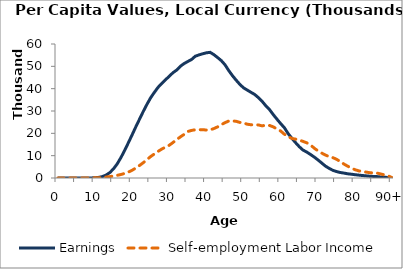
| Category | Earnings | Self-employment Labor Income |
|---|---|---|
| 0 | 0 | 0 |
|  | 0 | 0 |
| 2 | 0 | 0 |
| 3 | 0 | 0 |
| 4 | 0 | 0 |
| 5 | 0 | 0 |
| 6 | 0 | 21.203 |
| 7 | 6.211 | 26.112 |
| 8 | 13.631 | 31.021 |
| 9 | 36.46 | 40.029 |
| 10 | 109.593 | 63.723 |
| 11 | 287.129 | 119.737 |
| 12 | 644.481 | 234.313 |
| 13 | 1314.077 | 408.48 |
| 14 | 2434.62 | 633.393 |
| 15 | 4140.837 | 884.783 |
| 16 | 6378.06 | 1205.634 |
| 17 | 9210.337 | 1570.938 |
| 18 | 12388.586 | 2060.446 |
| 19 | 15845.288 | 2670.947 |
| 20 | 19355.538 | 3469.9 |
| 21 | 22941.965 | 4473.866 |
| 22 | 26385.965 | 5607.548 |
| 23 | 29815.259 | 6860.914 |
| 24 | 33014.417 | 8262.731 |
| 25 | 35968.337 | 9622.382 |
| 26 | 38393.078 | 10797.659 |
| 27 | 40632.079 | 11926.766 |
| 28 | 42365.035 | 12986.202 |
| 29 | 44020.9 | 13881.309 |
| 30 | 45557.453 | 14664.046 |
| 31 | 47165.605 | 15904.864 |
| 32 | 48342.145 | 17184.594 |
| 33 | 50043.633 | 18428.357 |
| 34 | 51256.093 | 19546.565 |
| 35 | 52176.635 | 20822.652 |
| 36 | 53066.418 | 21310.273 |
| 37 | 54524.137 | 21589.154 |
| 38 | 55120.665 | 21610.498 |
| 39 | 55621.138 | 21638.359 |
| 40 | 56058.348 | 21465.025 |
| 41 | 56268.849 | 21585.601 |
| 42 | 55240.251 | 22130.619 |
| 43 | 53937.381 | 22884.343 |
| 44 | 52566.379 | 23880.912 |
| 45 | 50703.274 | 24769.186 |
| 46 | 48118.833 | 25509.192 |
| 47 | 45835.288 | 25568.089 |
| 48 | 43801.718 | 25388.945 |
| 49 | 41917.652 | 24890.932 |
| 50 | 40367.704 | 24657.823 |
| 51 | 39353.933 | 24079.094 |
| 52 | 38359.489 | 23843.827 |
| 53 | 37394.204 | 23791.72 |
| 54 | 35974.403 | 23765.504 |
| 55 | 34312.93 | 23332.266 |
| 56 | 32307.607 | 23700.294 |
| 57 | 30589.668 | 23513.17 |
| 58 | 28375.7 | 22896.49 |
| 59 | 26311.052 | 21933.21 |
| 60 | 24334.995 | 21024.952 |
| 61 | 22480.178 | 19590.902 |
| 62 | 19874.852 | 18523.741 |
| 63 | 17780.469 | 17724.275 |
| 64 | 15823.091 | 17398.207 |
| 65 | 14010.376 | 16961.171 |
| 66 | 12499.804 | 16397.609 |
| 67 | 11629.135 | 15756.716 |
| 68 | 10552.16 | 14849.387 |
| 69 | 9414.606 | 13376.554 |
| 70 | 8130.794 | 12184.746 |
| 71 | 6762.993 | 11187.957 |
| 72 | 5372.892 | 10303.93 |
| 73 | 4345.826 | 9599.315 |
| 74 | 3471.118 | 9144.689 |
| 75 | 2905.792 | 8401.918 |
| 76 | 2468.069 | 7419.678 |
| 77 | 2211.952 | 6263.083 |
| 78 | 1888.181 | 5315.838 |
| 79 | 1703.005 | 4451.758 |
| 80 | 1476.869 | 3722.581 |
| 81 | 1291.585 | 3188.199 |
| 82 | 1114.687 | 2985.203 |
| 83 | 965.426 | 2637.588 |
| 84 | 798.129 | 2376.136 |
| 85 | 700.71 | 2239.395 |
| 86 | 621.72 | 2193.121 |
| 87 | 447.494 | 1774.158 |
| 88 | 325.45 | 1326.311 |
| 89 | 221.084 | 905.964 |
| 90+ | 28.111 | 119.701 |